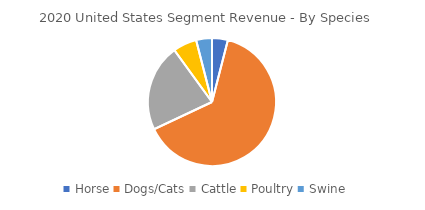
| Category | Series 0 |
|---|---|
| Horse | 0.04 |
| Dogs/Cats | 0.64 |
| Cattle | 0.22 |
| Poultry | 0.06 |
| Swine | 0.04 |